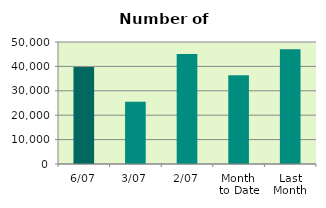
| Category | Series 0 |
|---|---|
| 6/07 | 39792 |
| 3/07 | 25526 |
| 2/07 | 45066 |
| Month 
to Date | 36417 |
| Last
Month | 46980.273 |